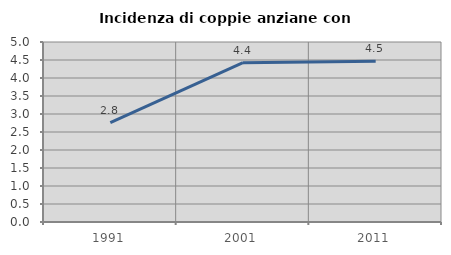
| Category | Incidenza di coppie anziane con figli |
|---|---|
| 1991.0 | 2.76 |
| 2001.0 | 4.427 |
| 2011.0 | 4.466 |